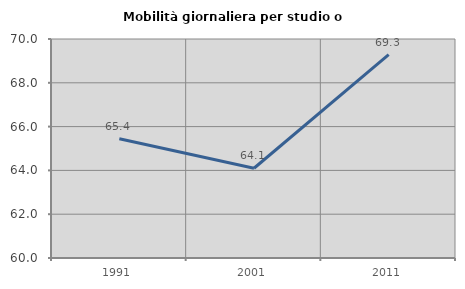
| Category | Mobilità giornaliera per studio o lavoro |
|---|---|
| 1991.0 | 65.442 |
| 2001.0 | 64.097 |
| 2011.0 | 69.285 |